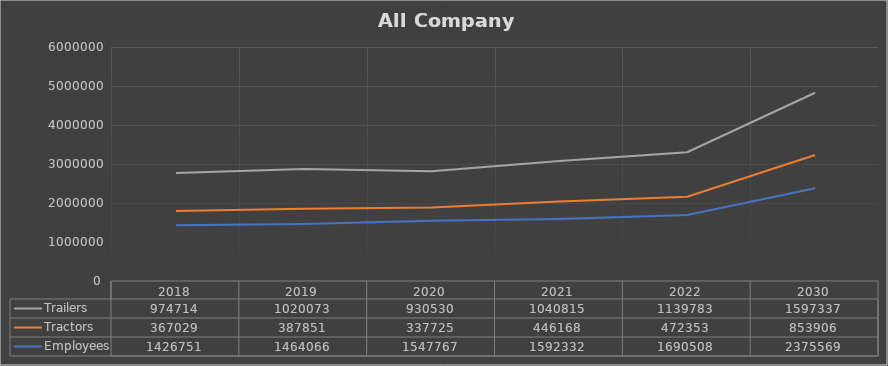
| Category | Employees | Tractors | Trailers |
|---|---|---|---|
| 2018.0 | 1426751 | 367029 | 974714 |
| 2019.0 | 1464066 | 387851 | 1020073 |
| 2020.0 | 1547767 | 337725 | 930530 |
| 2021.0 | 1592332 | 446168 | 1040815 |
| 2022.0 | 1690508 | 472353 | 1139783 |
| 2030.0 | 2375568.753 | 853905.88 | 1597337.261 |